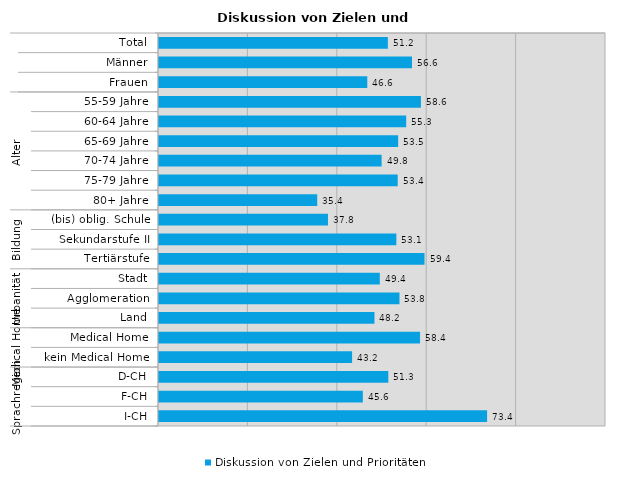
| Category | Diskussion von Zielen und Prioritäten |
|---|---|
| 0 | 51.2 |
| 1 | 56.6 |
| 2 | 46.6 |
| 3 | 58.6 |
| 4 | 55.3 |
| 5 | 53.5 |
| 6 | 49.8 |
| 7 | 53.4 |
| 8 | 35.4 |
| 9 | 37.8 |
| 10 | 53.1 |
| 11 | 59.4 |
| 12 | 49.4 |
| 13 | 53.8 |
| 14 | 48.2 |
| 15 | 58.4 |
| 16 | 43.2 |
| 17 | 51.3 |
| 18 | 45.6 |
| 19 | 73.4 |